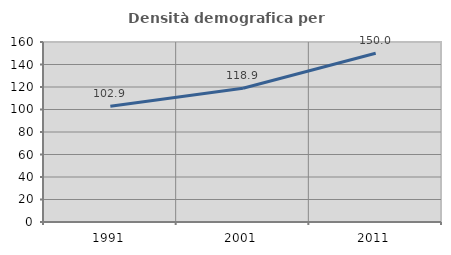
| Category | Densità demografica |
|---|---|
| 1991.0 | 102.863 |
| 2001.0 | 118.943 |
| 2011.0 | 150.018 |